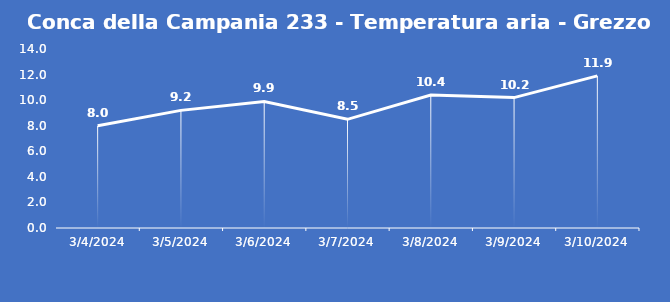
| Category | Conca della Campania 233 - Temperatura aria - Grezzo (°C) |
|---|---|
| 3/4/24 | 8 |
| 3/5/24 | 9.2 |
| 3/6/24 | 9.9 |
| 3/7/24 | 8.5 |
| 3/8/24 | 10.4 |
| 3/9/24 | 10.2 |
| 3/10/24 | 11.9 |